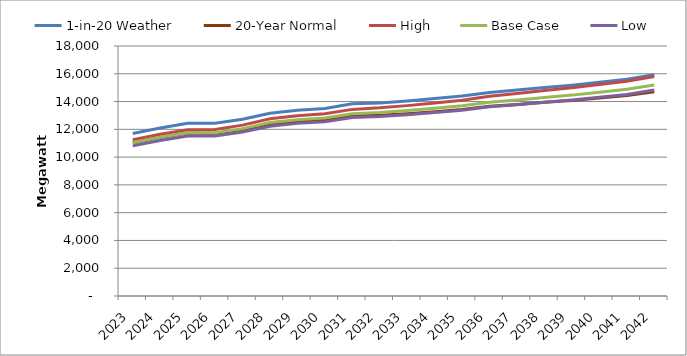
| Category | 1-in-20 Weather | 20-Year Normal | High | Base Case | Low |
|---|---|---|---|---|---|
| 2023.0 | 11700.428 | 11012.393 | 11245.948 | 11033.038 | 10809.2 |
| 2024.0 | 12094.307 | 11404.834 | 11646.182 | 11427.393 | 11199.939 |
| 2025.0 | 12434.743 | 11730.751 | 11970.996 | 11746.891 | 11517.017 |
| 2026.0 | 12430.673 | 11715.622 | 11995.151 | 11758.166 | 11523.083 |
| 2027.0 | 12724.545 | 11983.968 | 12303.854 | 12051.385 | 11808.148 |
| 2028.0 | 13158.741 | 12389.881 | 12755.468 | 12484.837 | 12228.482 |
| 2029.0 | 13370.289 | 12563.274 | 12972.133 | 12682.933 | 12429.193 |
| 2030.0 | 13505.151 | 12669.906 | 13114.492 | 12815.474 | 12550.212 |
| 2031.0 | 13835.248 | 12953.454 | 13436.655 | 13122.623 | 12847.331 |
| 2032.0 | 13904.675 | 13014.264 | 13546.137 | 13208.785 | 12921.094 |
| 2033.0 | 14047.306 | 13126.99 | 13706.911 | 13347.302 | 13047.297 |
| 2034.0 | 14214.446 | 13267.52 | 13895.309 | 13512.468 | 13203.721 |
| 2035.0 | 14395.393 | 13421.798 | 14099.463 | 13691.7 | 13373.014 |
| 2036.0 | 14653.279 | 13665.472 | 14388.436 | 13953.233 | 13620.981 |
| 2037.0 | 14826.478 | 13791.857 | 14583.585 | 14117.739 | 13769.168 |
| 2038.0 | 15010.866 | 13946.645 | 14795.14 | 14299.512 | 13944.456 |
| 2039.0 | 15179.44 | 14082.248 | 14991.549 | 14463.568 | 14103.676 |
| 2040.0 | 15389.187 | 14261.589 | 15228.261 | 14671.815 | 14301.882 |
| 2041.0 | 15601.031 | 14442.999 | 15466.652 | 14881.869 | 14508.723 |
| 2042.0 | 15932.415 | 14712.855 | 15802.546 | 15186.938 | 14824.411 |